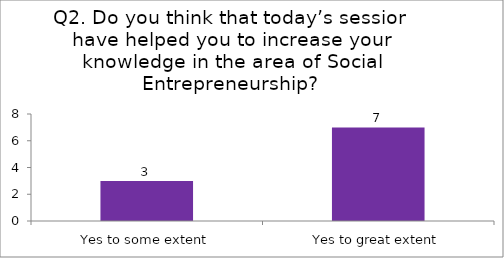
| Category | Q2. Do you think that today’s session have helped you to increase your knowledge in the area of Social Entrepreneurship? |
|---|---|
| Yes to some extent | 3 |
| Yes to great extent | 7 |